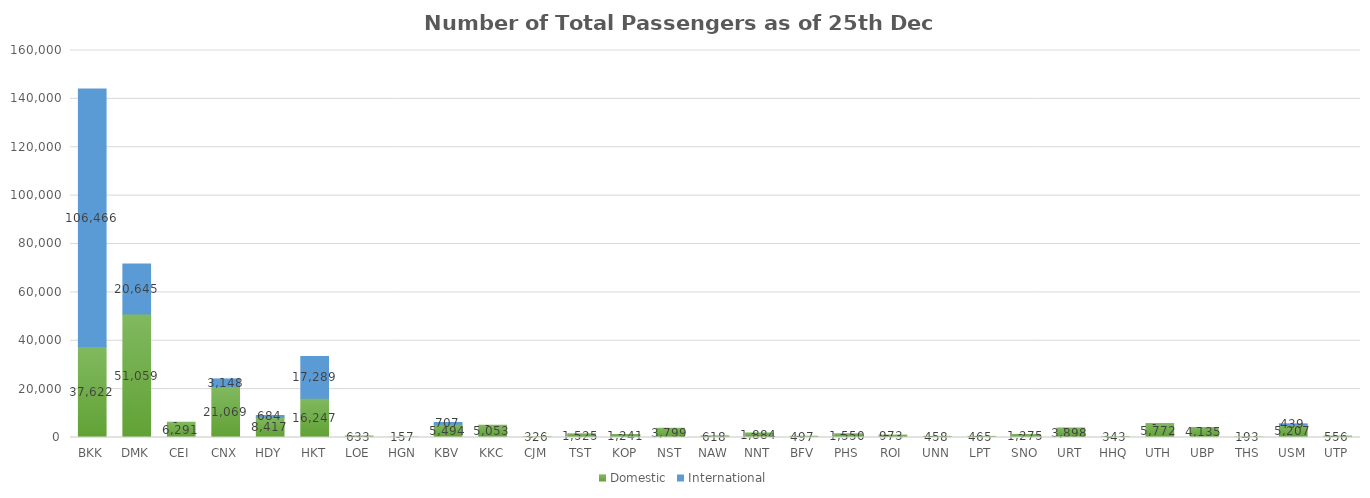
| Category | Domestic | International |
|---|---|---|
| BKK | 37622 | 106466 |
| DMK | 51059 | 20645 |
| CEI | 6291 | 0 |
| CNX | 21069 | 3148 |
| HDY | 8417 | 684 |
| HKT | 16247 | 17289 |
| LOE | 633 | 0 |
| HGN | 157 | 0 |
| KBV | 5494 | 707 |
| KKC | 5053 | 0 |
| CJM | 326 | 0 |
| TST | 1525 | 0 |
| KOP | 1241 | 0 |
| NST | 3799 | 0 |
| NAW | 618 | 0 |
| NNT | 1884 | 0 |
| BFV | 497 | 0 |
| PHS | 1550 | 0 |
| ROI | 973 | 0 |
| UNN | 458 | 0 |
| LPT | 465 | 0 |
| SNO | 1275 | 0 |
| URT | 3898 | 0 |
| HHQ | 343 | 0 |
| UTH | 5772 | 0 |
| UBP | 4135 | 0 |
| THS | 193 | 0 |
| USM | 5207 | 439 |
| UTP | 556 | 0 |